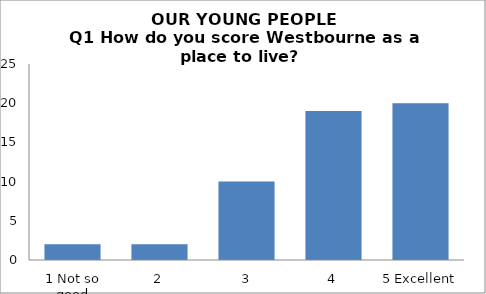
| Category | Series 0 |
|---|---|
| 1 Not so good | 2 |
| 2 | 2 |
| 3 | 10 |
| 4 | 19 |
| 5 Excellent | 20 |